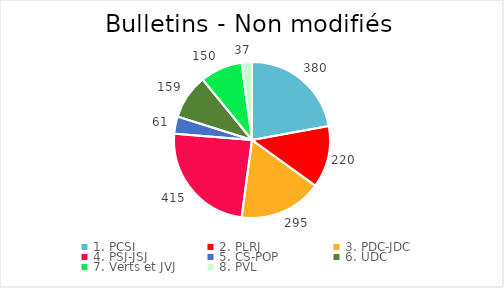
| Category | Series 0 |
|---|---|
| 1. PCSI | 380 |
| 2. PLRJ | 220 |
| 3. PDC-JDC | 295 |
| 4. PSJ-JSJ | 415 |
| 5. CS-POP | 61 |
| 6. UDC | 159 |
| 7. Verts et JVJ | 150 |
| 8. PVL | 37 |